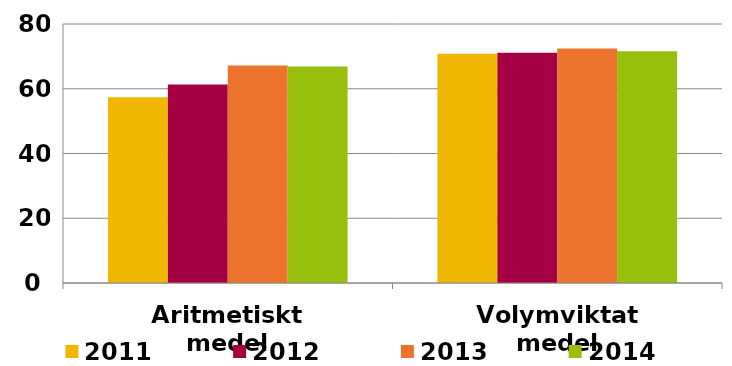
| Category | 2011 | 2012 | 2013 | 2014 |
|---|---|---|---|---|
| Aritmetiskt medel | 57.395 | 61.326 | 67.197 | 66.904 |
| Volymviktat medel | 70.84 | 71.103 | 72.4 | 71.574 |